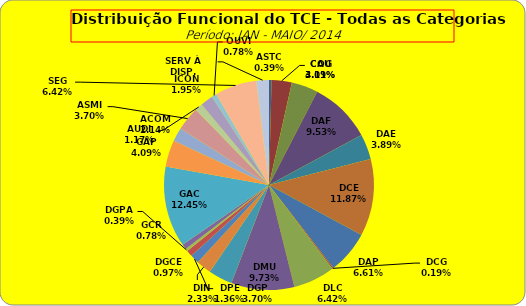
| Category | ASTC COG CAU DAF DAE DCE DAP DCG DLC DMU DGP DIN DPE DGCE DGPA GCR GAC GAP ACOM ASMI AUDI ICON OUVI SEG SERV À DISP. |
|---|---|
| ASTC | 2 |
| COG | 16 |
| CAU | 21 |
| DAF | 49 |
| DAE | 20 |
| DCE | 61 |
| DAP | 34 |
| DCG | 1 |
| DLC | 33 |
| DMU | 50 |
| DGP | 19 |
| DIN | 12 |
| DPE | 7 |
| DGCE | 5 |
| DGPA | 2 |
| GCR | 4 |
| GAC | 64 |
| GAP | 21 |
| ACOM | 11 |
| ASMI | 19 |
| AUDI | 6 |
| ICON | 10 |
| OUVI | 4 |
| SEG | 33 |
| SERV À DISP. | 10 |